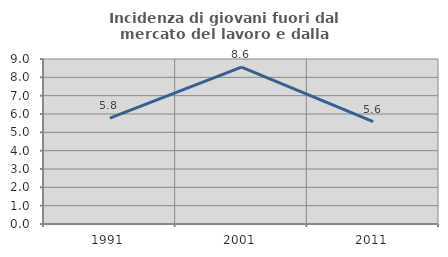
| Category | Incidenza di giovani fuori dal mercato del lavoro e dalla formazione  |
|---|---|
| 1991.0 | 5.78 |
| 2001.0 | 8.553 |
| 2011.0 | 5.581 |